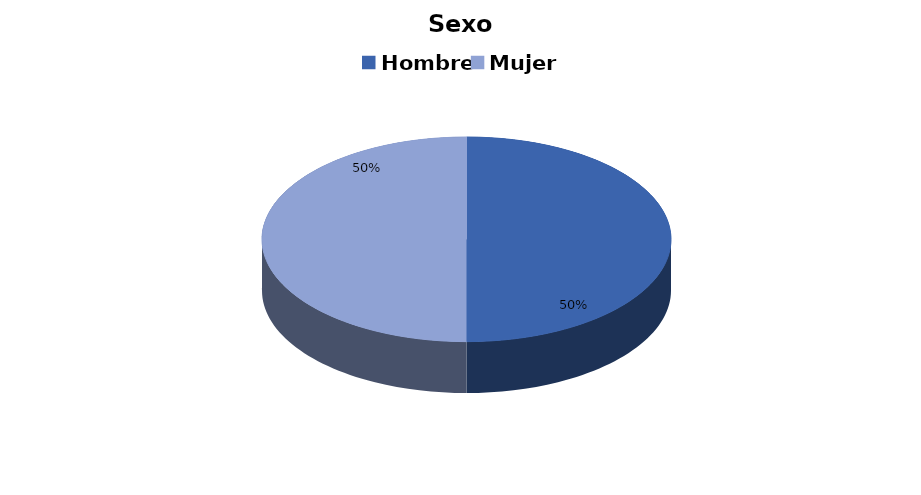
| Category | Sexo |
|---|---|
| Hombre | 11 |
| Mujer | 11 |